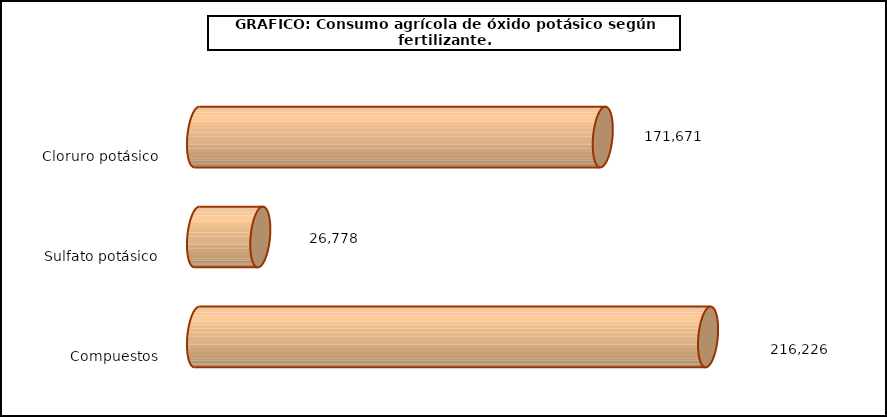
| Category | fert. N |
|---|---|
| 0 | 171671 |
| 1 | 26778 |
| 2 | 216226 |